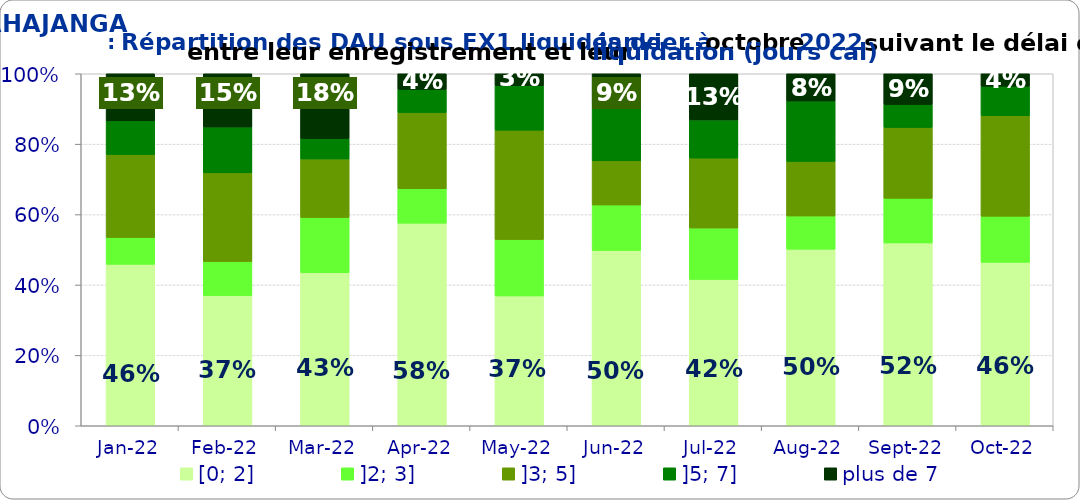
| Category | [0; 2] | ]2; 3] | ]3; 5] | ]5; 7] | plus de 7 |
|---|---|---|---|---|---|
| 2022-01-01 | 0.459 | 0.076 | 0.236 | 0.096 | 0.134 |
| 2022-02-01 | 0.37 | 0.097 | 0.252 | 0.13 | 0.151 |
| 2022-03-01 | 0.435 | 0.157 | 0.166 | 0.058 | 0.184 |
| 2022-04-01 | 0.576 | 0.098 | 0.216 | 0.065 | 0.045 |
| 2022-05-01 | 0.369 | 0.16 | 0.311 | 0.126 | 0.034 |
| 2022-06-01 | 0.498 | 0.129 | 0.125 | 0.161 | 0.086 |
| 2022-07-01 | 0.416 | 0.146 | 0.199 | 0.109 | 0.131 |
| 2022-08-01 | 0.502 | 0.094 | 0.155 | 0.172 | 0.077 |
| 2022-09-01 | 0.519 | 0.127 | 0.201 | 0.065 | 0.088 |
| 2022-10-01 | 0.464 | 0.131 | 0.286 | 0.083 | 0.036 |